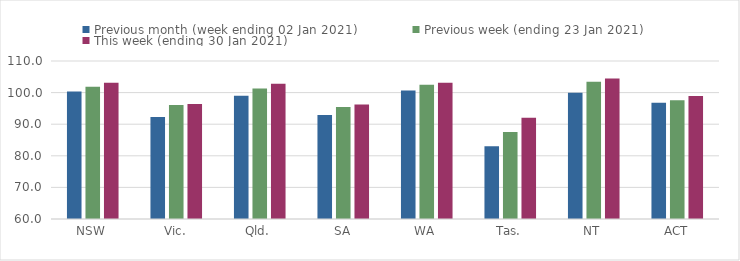
| Category | Previous month (week ending 02 Jan 2021) | Previous week (ending 23 Jan 2021) | This week (ending 30 Jan 2021) |
|---|---|---|---|
| NSW | 100.34 | 101.89 | 103.14 |
| Vic. | 92.24 | 96.08 | 96.39 |
| Qld. | 99.02 | 101.28 | 102.84 |
| SA | 92.9 | 95.45 | 96.26 |
| WA | 100.66 | 102.52 | 103.09 |
| Tas. | 83.05 | 87.51 | 92.03 |
| NT | 99.92 | 103.41 | 104.49 |
| ACT | 96.78 | 97.61 | 98.95 |